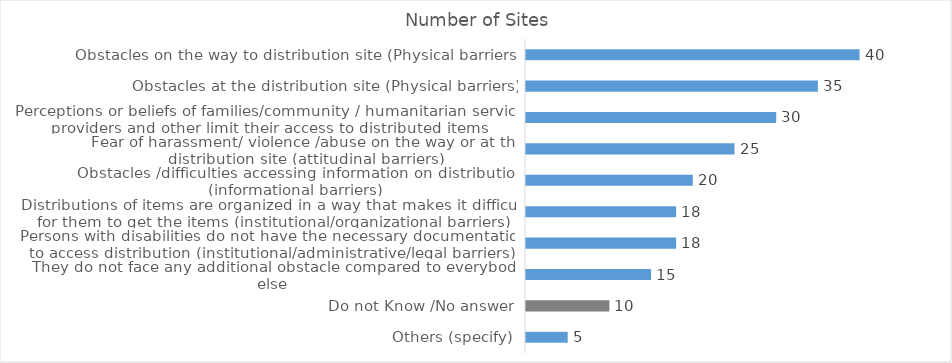
| Category | Additional Obstacles faced by Persons with Disabilities in in obtaining items from distributions (e.g., food, money/vouchers/cards, NFIs distributions) |
|---|---|
| Others (specify) | 5 |
| Do not Know /No answer | 10 |
| They do not face any additional obstacle compared to everybody else | 15 |
| Persons with disabilities do not have the necessary documentation to access distribution (institutional/administrative/legal barriers) | 18 |
| Distributions of items are organized in a way that makes it difficult for them to get the items (institutional/organizational barriers) | 18 |
| Obstacles /difficulties accessing information on distribution (informational barriers) | 20 |
| Fear of harassment/ violence /abuse on the way or at the distribution site (attitudinal barriers) | 25 |
| Perceptions or beliefs of families/community / humanitarian service providers and other limit their access to distributed items (attitudinal barriers) | 30 |
| Obstacles at the distribution site (Physical barriers) | 35 |
| Obstacles on the way to distribution site (Physical barriers) | 40 |